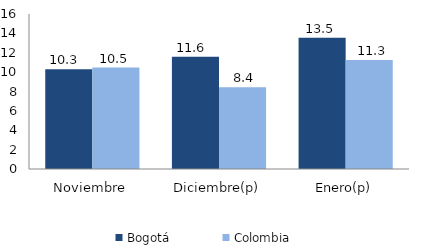
| Category | Bogotá | Colombia |
|---|---|---|
| Noviembre | 10.289 | 10.476 |
| Diciembre(p) | 11.58 | 8.429 |
| Enero(p) | 13.539 | 11.262 |